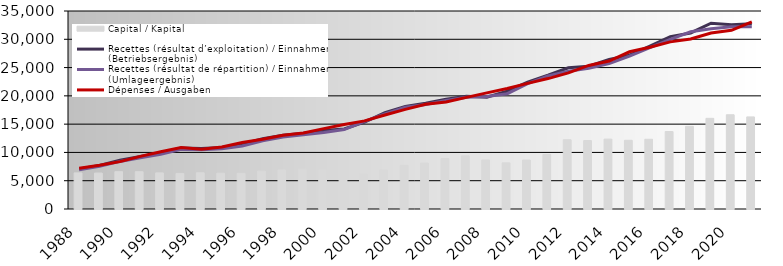
| Category | Capital / Kapital |
|---|---|
| 1988.0 | 6384.121 |
| 1989.0 | 6355.865 |
| 1990.0 | 6599.606 |
| 1991.0 | 6593.207 |
| 1992.0 | 6383.645 |
| 1993.0 | 6283.626 |
| 1994.0 | 6409.964 |
| 1995.0 | 6327.942 |
| 1996.0 | 6310.614 |
| 1997.0 | 6695.56 |
| 1998.0 | 6910.856 |
| 1999.0 | 7039.073 |
| 2000.0 | 6934.667 |
| 2001.0 | 6257.167 |
| 2002.0 | 6166.036 |
| 2003.0 | 6885.564 |
| 2004.0 | 7717.499 |
| 2005.0 | 8118.736 |
| 2006.0 | 8913.002 |
| 2007.0 | 9394.183 |
| 2008.0 | 8665.965 |
| 2009.0 | 8153.593 |
| 2010.0 | 8651.283 |
| 2011.0 | 9648.971 |
| 2012.0 | 12241.236 |
| 2013.0 | 12096.136 |
| 2014.0 | 12352.54 |
| 2015.0 | 12142.154 |
| 2016.0 | 12328.55 |
| 2017.0 | 13693.95 |
| 2018.0 | 14611.395 |
| 2019.0 | 16027.065 |
| 2020.0 | 16658.942 |
| 2021.0 | 16279.54 |